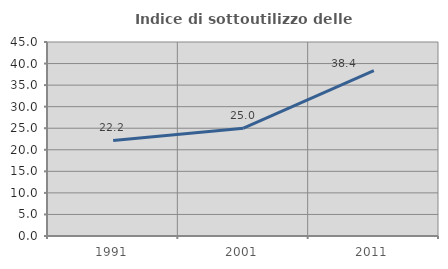
| Category | Indice di sottoutilizzo delle abitazioni  |
|---|---|
| 1991.0 | 22.165 |
| 2001.0 | 25.021 |
| 2011.0 | 38.386 |